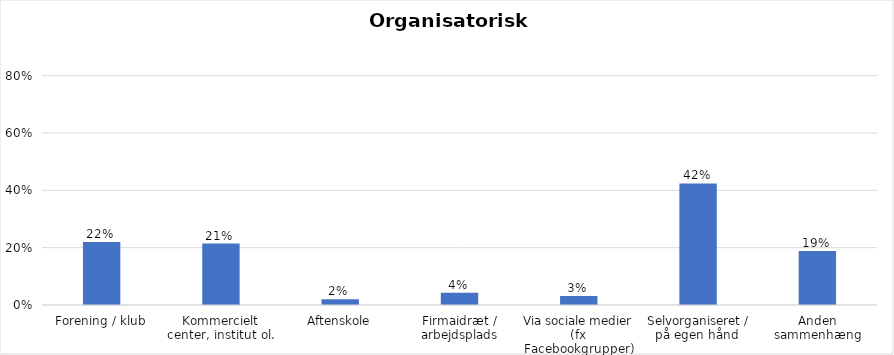
| Category | % |
|---|---|
| Forening / klub | 0.22 |
| Kommercielt center, institut ol. | 0.214 |
| Aftenskole | 0.02 |
| Firmaidræt / arbejdsplads | 0.043 |
| Via sociale medier (fx Facebookgrupper) | 0.032 |
| Selvorganiseret / på egen hånd  | 0.424 |
| Anden sammenhæng | 0.188 |